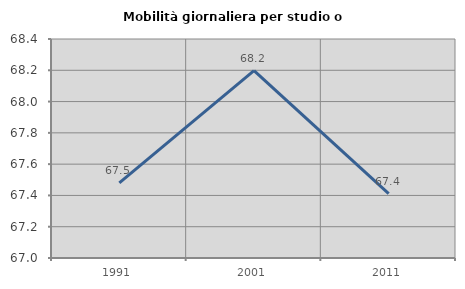
| Category | Mobilità giornaliera per studio o lavoro |
|---|---|
| 1991.0 | 67.48 |
| 2001.0 | 68.198 |
| 2011.0 | 67.411 |